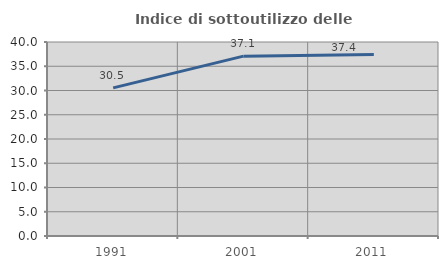
| Category | Indice di sottoutilizzo delle abitazioni  |
|---|---|
| 1991.0 | 30.546 |
| 2001.0 | 37.08 |
| 2011.0 | 37.414 |